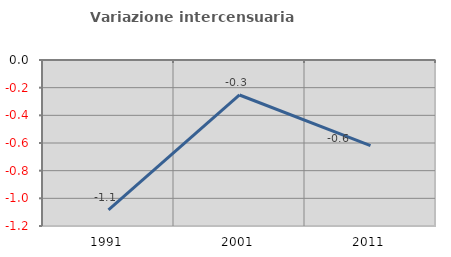
| Category | Variazione intercensuaria annua |
|---|---|
| 1991.0 | -1.083 |
| 2001.0 | -0.253 |
| 2011.0 | -0.62 |